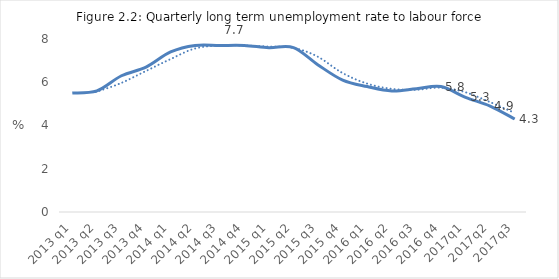
| Category | Series 0 |
|---|---|
| 2013 q1 | 5.5 |
| 2013 q2 | 5.6 |
| 2013 q3 | 6.3 |
| 2013 q4 | 6.7 |
| 2014 q1 | 7.4 |
| 2014 q2 | 7.7 |
| 2014 q3 | 7.7 |
| 2014 q4 | 7.7 |
| 2015 q1 | 7.6 |
| 2015 q2 | 7.6 |
| 2015 q3 | 6.8 |
| 2015 q4 | 6.1 |
| 2016 q1 | 5.8 |
| 2016 q2 | 5.6 |
| 2016 q3 | 5.7 |
| 2016 q4 | 5.8 |
| 2017q1 | 5.3 |
| 2017q2 | 4.9 |
| 2017q3 | 4.3 |